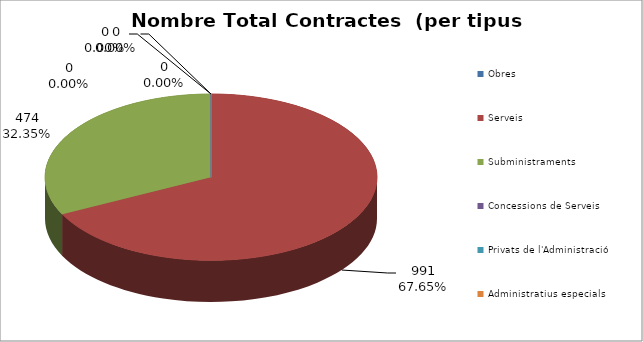
| Category | Nombre Total Contractes |
|---|---|
| Obres | 0 |
| Serveis | 991 |
| Subministraments | 474 |
| Concessions de Serveis | 0 |
| Privats de l'Administració | 0 |
| Administratius especials | 0 |